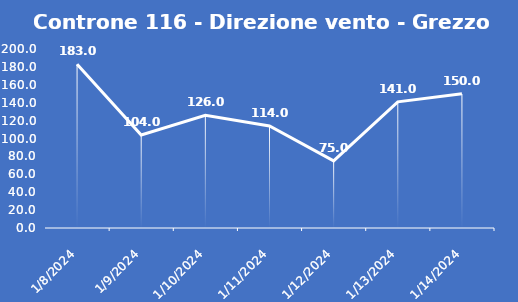
| Category | Controne 116 - Direzione vento - Grezzo (°N) |
|---|---|
| 1/8/24 | 183 |
| 1/9/24 | 104 |
| 1/10/24 | 126 |
| 1/11/24 | 114 |
| 1/12/24 | 75 |
| 1/13/24 | 141 |
| 1/14/24 | 150 |